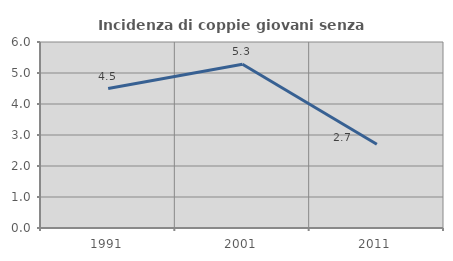
| Category | Incidenza di coppie giovani senza figli |
|---|---|
| 1991.0 | 4.5 |
| 2001.0 | 5.283 |
| 2011.0 | 2.7 |